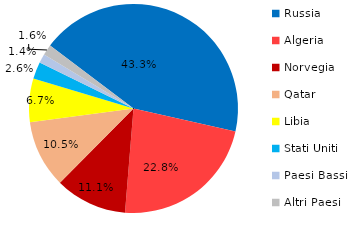
| Category | Series 0 |
|---|---|
| Russia | 28716.082 |
| Algeria | 15117.91 |
| Norvegia | 7397.403 |
| Qatar | 6944.106 |
| Libia | 4460.002 |
| Stati Uniti | 1754.28 |
| Paesi Bassi | 914.152 |
| Altri Paesi  | 1088.895 |